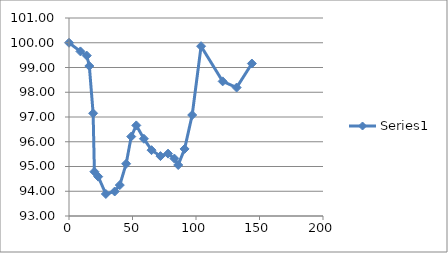
| Category | Series 0 |
|---|---|
| 0.0 | 100 |
| 9.0 | 99.65 |
| 14.0 | 99.48 |
| 16.0 | 99.06 |
| 19.0 | 97.15 |
| 20.0 | 94.79 |
| 23.0 | 94.59 |
| 29.0 | 93.89 |
| 36.0 | 93.99 |
| 40.0 | 94.25 |
| 45.0 | 95.11 |
| 49.0 | 96.21 |
| 53.0 | 96.66 |
| 59.0 | 96.12 |
| 65.0 | 95.66 |
| 72.0 | 95.42 |
| 78.0 | 95.52 |
| 83.0 | 95.32 |
| 86.0 | 95.06 |
| 91.0 | 95.71 |
| 97.0 | 97.08 |
| 104.0 | 99.86 |
| 121.0 | 98.44 |
| 132.0 | 98.19 |
| 144.0 | 99.16 |